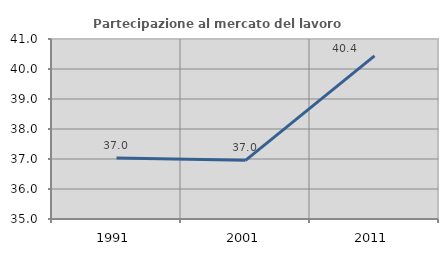
| Category | Partecipazione al mercato del lavoro  femminile |
|---|---|
| 1991.0 | 37.032 |
| 2001.0 | 36.954 |
| 2011.0 | 40.435 |